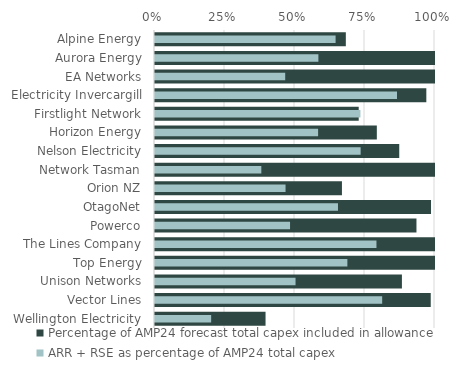
| Category | Percentage of AMP24 forecast total capex included in allowance |
|---|---|
| Wellington Electricity | 0.395 |
| Vector Lines | 0.985 |
| Unison Networks | 0.882 |
| Top Energy | 1 |
| The Lines Company | 1 |
| Powerco | 0.934 |
| OtagoNet | 0.986 |
| Orion NZ | 0.668 |
| Network Tasman | 1 |
| Nelson Electricity | 0.872 |
| Horizon Energy | 0.792 |
| Firstlight Network | 0.728 |
| Electricity Invercargill | 0.969 |
| EA Networks | 1 |
| Aurora Energy | 1 |
| Alpine Energy | 0.682 |